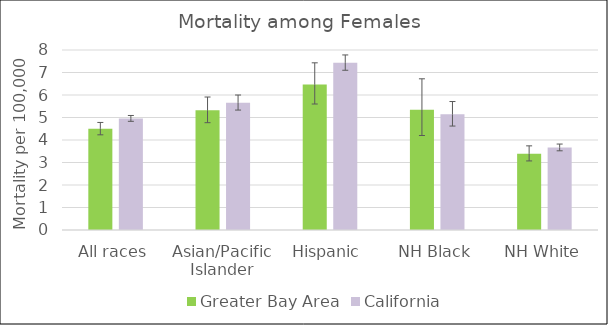
| Category | Greater Bay Area | California | US Mortality |
|---|---|---|---|
| All races | 4.5 | 4.96 |  |
| Asian/Pacific Islander | 5.32 | 5.66 |  |
| Hispanic | 6.47 | 7.43 |  |
| NH Black | 5.34 | 5.14 |  |
| NH White | 3.39 | 3.67 |  |